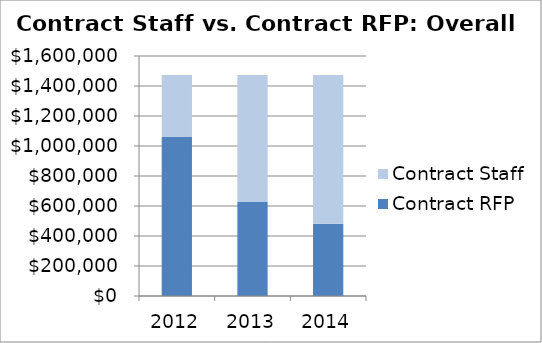
| Category | Contract RFP | Contract Staff |
|---|---|---|
| 2012.0 | 1060560 | 412440 |
| 2013.0 | 626025 | 846975 |
| 2014.0 | 482000 | 991000 |